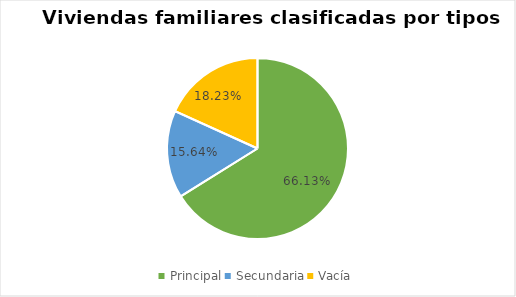
| Category | Series 0 |
|---|---|
| Principal | 0.661 |
| Secundaria | 0.156 |
| Vacía | 0.182 |